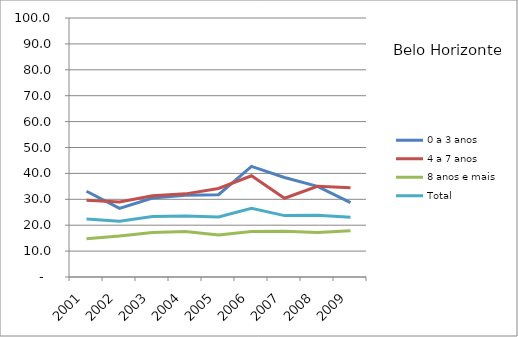
| Category | 0 a 3 anos | 4 a 7 anos | 8 anos e mais | Total |
|---|---|---|---|---|
| 2001.0 | 33.1 | 29.6 | 14.8 | 22.4 |
| 2002.0 | 26.5 | 29 | 15.8 | 21.5 |
| 2003.0 | 30.5 | 31.4 | 17.2 | 23.4 |
| 2004.0 | 31.6 | 32.1 | 17.6 | 23.6 |
| 2005.0 | 31.8 | 34.2 | 16.2 | 23.2 |
| 2006.0 | 42.7 | 39.1 | 17.6 | 26.5 |
| 2007.0 | 38.4 | 30.4 | 17.7 | 23.7 |
| 2008.0 | 35 | 35 | 17.2 | 23.8 |
| 2009.0 | 28.7 | 34.5 | 17.9 | 23.1 |